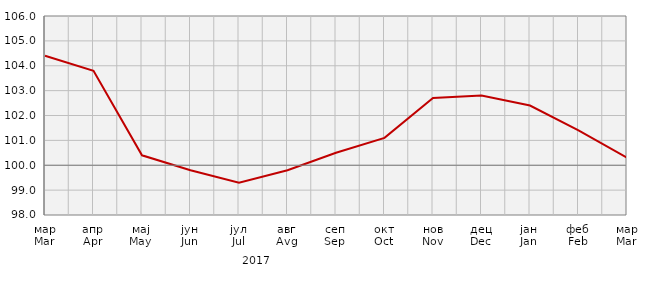
| Category | Индекси цијена произвођача
Producer price indices |
|---|---|
| мар
Mar | 104.4 |
| апр
Apr | 103.8 |
| мај
May | 100.4 |
| јун
Jun | 99.8 |
| јул
Jul | 99.3 |
| авг
Avg | 99.8 |
| сеп
Sep | 100.5 |
| окт
Oct | 101.1 |
| нов
Nov | 102.7 |
| дец
Dec | 102.8 |
| јан
Jan | 102.4 |
| феб
Feb | 101.4 |
| мар
Mar | 100.3 |